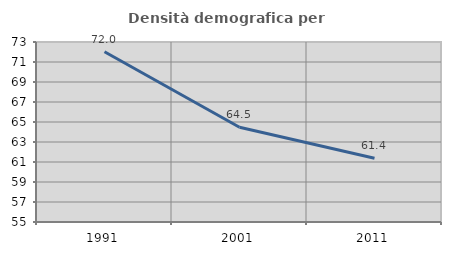
| Category | Densità demografica |
|---|---|
| 1991.0 | 72.029 |
| 2001.0 | 64.471 |
| 2011.0 | 61.383 |